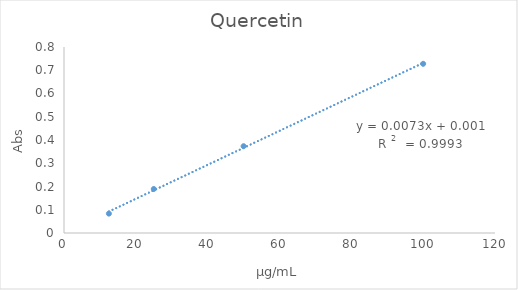
| Category | Series 0 |
|---|---|
| 12.5 | 0.083 |
| 25.0 | 0.189 |
| 50.0 | 0.373 |
| 100.0 | 0.728 |